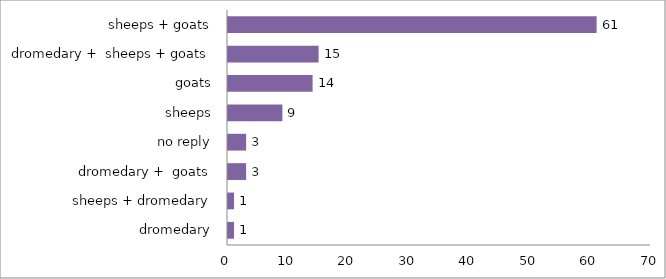
| Category | Series 0 |
|---|---|
| dromedary | 1 |
| sheeps + dromedary | 1 |
| dromedary +  goats | 3 |
| no reply | 3 |
| sheeps | 9 |
| goats | 14 |
| dromedary +  sheeps + goats | 15 |
| sheeps + goats | 61 |